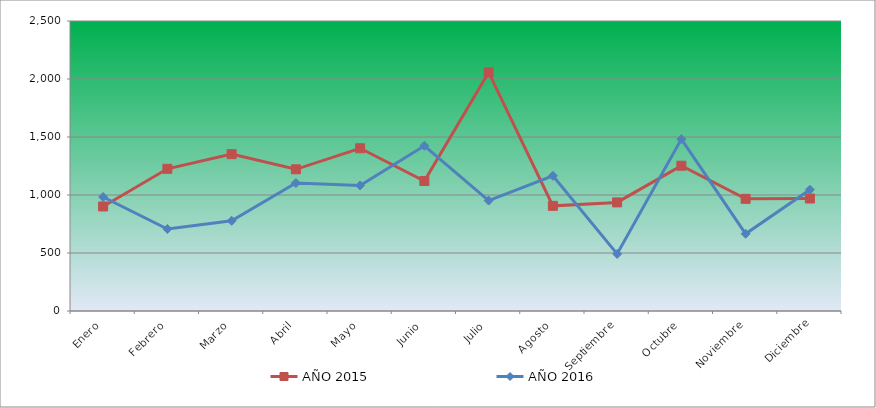
| Category | AÑO 2015 | AÑO 2016 |
|---|---|---|
| Enero | 901.236 | 982.961 |
| Febrero | 1225.917 | 707.103 |
| Marzo | 1352.13 | 777.757 |
| Abril | 1221.524 | 1103.064 |
| Mayo | 1402.908 | 1082.562 |
| Junio | 1120.748 | 1424.431 |
| Julio | 2057.059 | 952.026 |
| Agosto | 906.452 | 1165.444 |
| Septiembre | 936.143 | 491.86 |
| Octubre | 1252.514 | 1481.624 |
| Noviembre | 967.038 | 665.64 |
| Diciembre | 969.79 | 1045.855 |